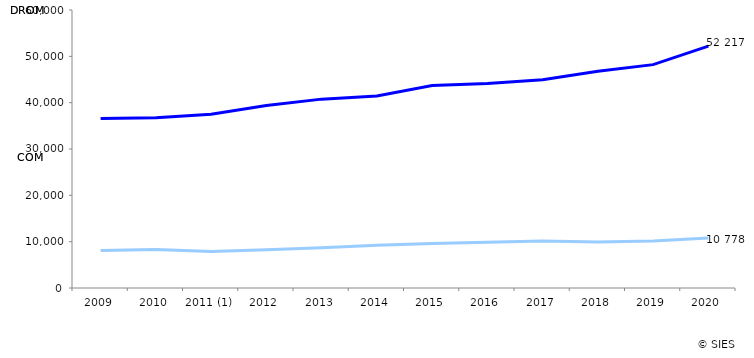
| Category | DROM | COM |
|---|---|---|
| 2009 | 36564 | 8114 |
| 2010 | 36745 | 8311 |
| 2011 (1) | 37517 | 7867 |
| 2012 | 39410 | 8242 |
| 2013 | 40763 | 8666 |
| 2014 | 41427 | 9215 |
| 2015 | 43691 | 9586 |
| 2016 | 44142 | 9875 |
| 2017 | 44934 | 10132 |
| 2018 | 46757 | 9949 |
| 2019 | 48207 | 10136 |
| 2020 | 52217 | 10778 |